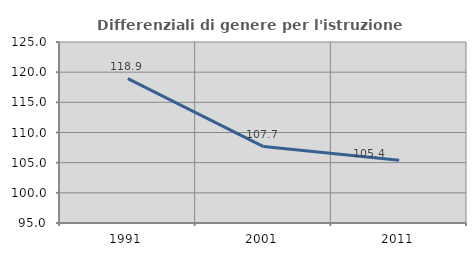
| Category | Differenziali di genere per l'istruzione superiore |
|---|---|
| 1991.0 | 118.929 |
| 2001.0 | 107.664 |
| 2011.0 | 105.396 |